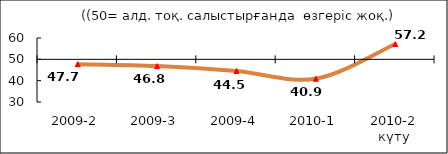
| Category | Диф.индекс ↓ |
|---|---|
| 2009-2 | 47.725 |
| 2009-3 | 46.82 |
| 2009-4 | 44.53 |
| 2010-1 | 40.91 |
| 2010-2 күту | 57.17 |